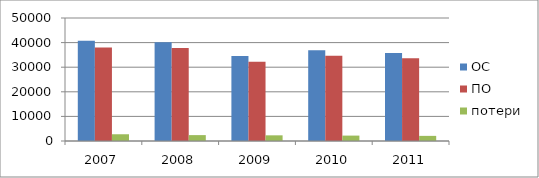
| Category | ОС | ПО | потери |
|---|---|---|---|
| 0 | 40744 | 38002.169 | 2741.831 |
| 1 | 40148 | 37754.249 | 2393.751 |
| 2 | 34511 | 32205.374 | 2305.626 |
| 3 | 36871.004 | 34673.673 | 2197.331 |
| 4 | 35751.155 | 33667.706 | 2083.448 |